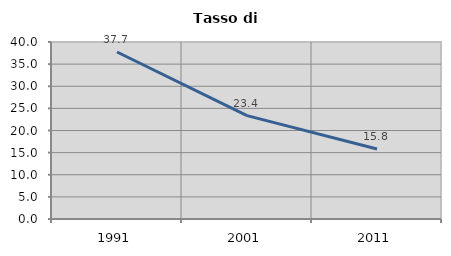
| Category | Tasso di disoccupazione   |
|---|---|
| 1991.0 | 37.741 |
| 2001.0 | 23.368 |
| 2011.0 | 15.832 |